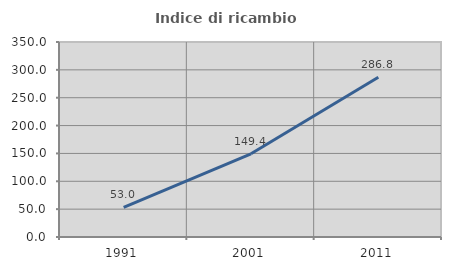
| Category | Indice di ricambio occupazionale  |
|---|---|
| 1991.0 | 53.043 |
| 2001.0 | 149.367 |
| 2011.0 | 286.842 |